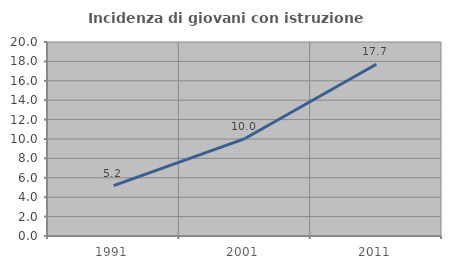
| Category | Incidenza di giovani con istruzione universitaria |
|---|---|
| 1991.0 | 5.189 |
| 2001.0 | 10.046 |
| 2011.0 | 17.699 |